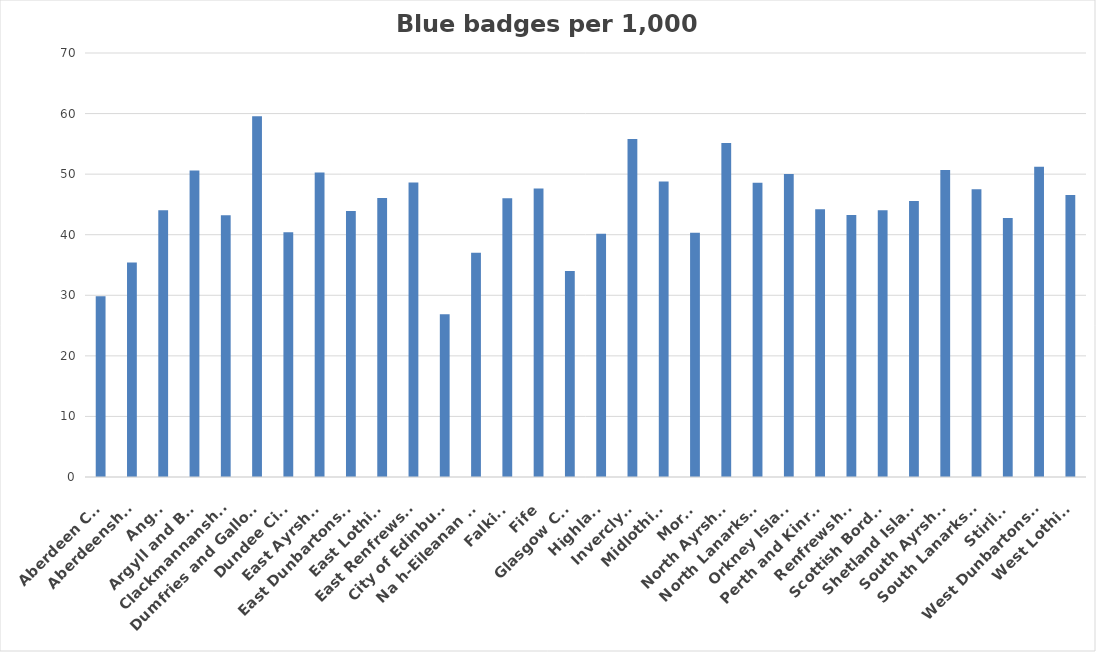
| Category | Rates |
|---|---|
| Aberdeen City | 29.825 |
| Aberdeenshire | 35.42 |
| Angus | 44.036 |
| Argyll and Bute | 50.588 |
| Clackmannanshire | 43.209 |
| Dumfries and Galloway | 59.539 |
| Dundee City | 40.403 |
| East Ayrshire | 50.275 |
| East Dunbartonshire | 43.925 |
| East Lothian | 46.073 |
| East Renfrewshire | 48.603 |
| City of Edinburgh | 26.874 |
| Na h-Eileanan Siar | 37.013 |
| Falkirk | 46.019 |
| Fife | 47.619 |
| Glasgow City | 34.008 |
| Highland | 40.156 |
| Inverclyde | 55.797 |
| Midlothian | 48.799 |
| Moray | 40.315 |
| North Ayrshire | 55.143 |
| North Lanarkshire | 48.587 |
| Orkney Islands | 50.022 |
| Perth and Kinross | 44.186 |
| Renfrewshire | 43.238 |
| Scottish Borders | 44.031 |
| Shetland Islands | 45.55 |
| South Ayrshire | 50.679 |
| South Lanarkshire | 47.487 |
| Stirling | 42.756 |
| West Dunbartonshire | 51.209 |
| West Lothian | 46.565 |